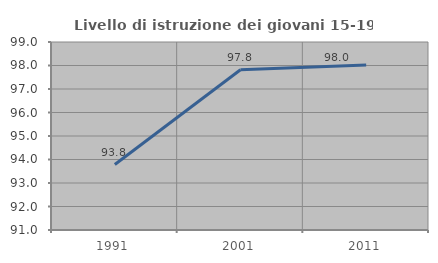
| Category | Livello di istruzione dei giovani 15-19 anni |
|---|---|
| 1991.0 | 93.787 |
| 2001.0 | 97.822 |
| 2011.0 | 98.024 |